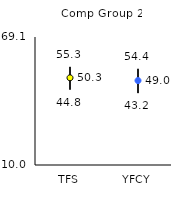
| Category | 25th | 75th | Mean |
|---|---|---|---|
| TFS | 44.8 | 55.3 | 50.26 |
| YFCY | 43.2 | 54.4 | 48.98 |